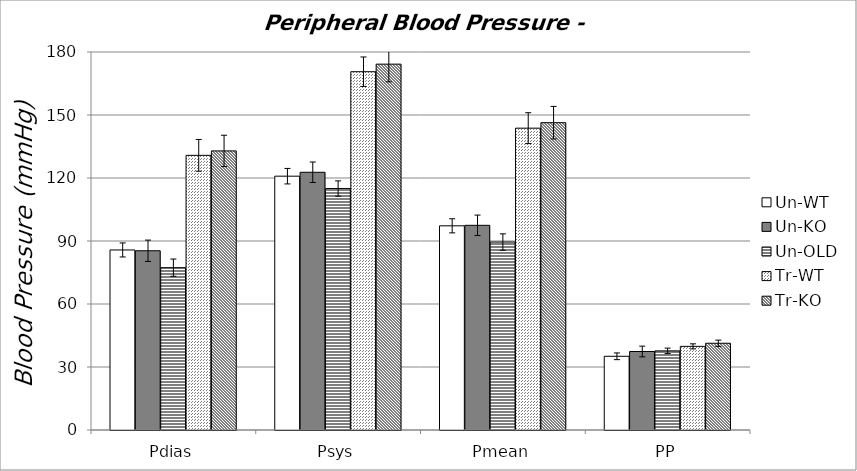
| Category | Un-WT | Un-KO | Un-OLD | Tr-WT | Tr-KO |
|---|---|---|---|---|---|
| Pdias | 85.733 | 85.351 | 77.301 | 130.791 | 132.906 |
| Psys | 120.869 | 122.731 | 114.985 | 170.616 | 174.214 |
| Pmean | 97.229 | 97.469 | 89.501 | 143.73 | 146.341 |
| PP | 35.099 | 37.379 | 37.683 | 39.825 | 41.308 |